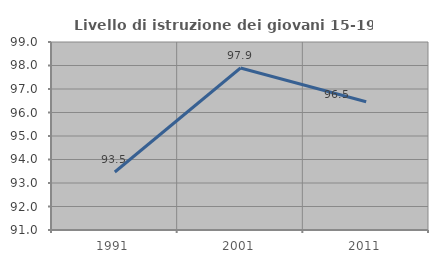
| Category | Livello di istruzione dei giovani 15-19 anni |
|---|---|
| 1991.0 | 93.469 |
| 2001.0 | 97.895 |
| 2011.0 | 96.46 |